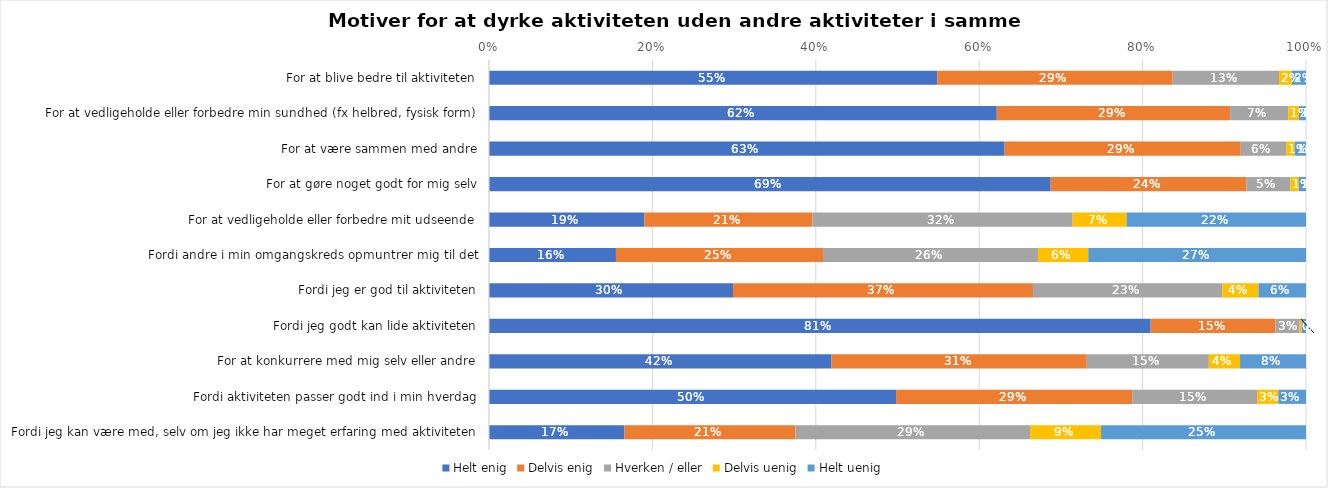
| Category | Helt enig | Delvis enig | Hverken / eller | Delvis uenig | Helt uenig |
|---|---|---|---|---|---|
| For at blive bedre til aktiviteten | 0.549 | 0.288 | 0.13 | 0.016 | 0.017 |
| For at vedligeholde eller forbedre min sundhed (fx helbred, fysisk form) | 0.622 | 0.286 | 0.071 | 0.013 | 0.009 |
| For at være sammen med andre | 0.631 | 0.289 | 0.056 | 0.01 | 0.014 |
| For at gøre noget godt for mig selv | 0.688 | 0.24 | 0.054 | 0.01 | 0.009 |
| For at vedligeholde eller forbedre mit udseende | 0.19 | 0.206 | 0.319 | 0.066 | 0.22 |
| Fordi andre i min omgangskreds opmuntrer mig til det | 0.155 | 0.253 | 0.263 | 0.062 | 0.266 |
| Fordi jeg er god til aktiviteten | 0.299 | 0.367 | 0.232 | 0.044 | 0.058 |
| Fordi jeg godt kan lide aktiviteten | 0.81 | 0.153 | 0.03 | 0.003 | 0.005 |
| For at konkurrere med mig selv eller andre | 0.419 | 0.312 | 0.149 | 0.038 | 0.081 |
| Fordi aktiviteten passer godt ind i min hverdag | 0.498 | 0.289 | 0.153 | 0.026 | 0.034 |
| Fordi jeg kan være med, selv om jeg ikke har meget erfaring med aktiviteten | 0.166 | 0.209 | 0.287 | 0.087 | 0.251 |